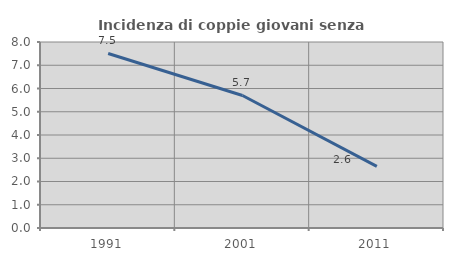
| Category | Incidenza di coppie giovani senza figli |
|---|---|
| 1991.0 | 7.508 |
| 2001.0 | 5.701 |
| 2011.0 | 2.648 |